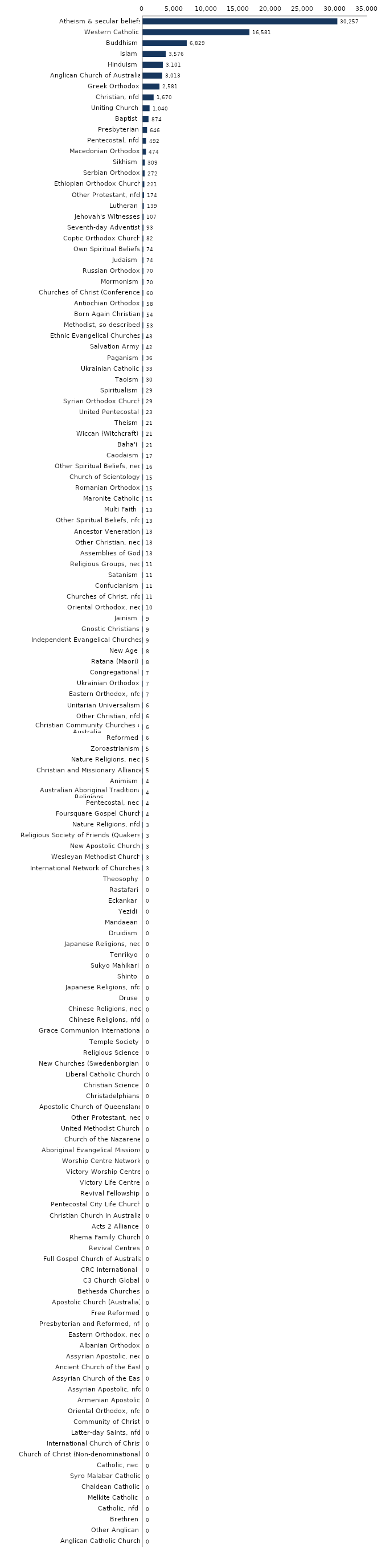
| Category | Series 0 |
|---|---|
| Atheism & secular beliefs | 30257 |
| Western Catholic | 16581 |
| Buddhism | 6829 |
| Islam | 3576 |
| Hinduism | 3101 |
| Anglican Church of Australia | 3013 |
| Greek Orthodox | 2581 |
| Christian, nfd | 1670 |
| Uniting Church | 1040 |
| Baptist | 874 |
| Presbyterian | 646 |
| Pentecostal, nfd | 492 |
| Macedonian Orthodox | 474 |
| Sikhism | 309 |
| Serbian Orthodox | 272 |
| Ethiopian Orthodox Church | 221 |
| Other Protestant, nfd | 174 |
| Lutheran | 139 |
| Jehovah's Witnesses | 107 |
| Seventh-day Adventist | 93 |
| Coptic Orthodox Church | 82 |
| Own Spiritual Beliefs | 74 |
| Judaism | 74 |
| Russian Orthodox | 70 |
| Mormonism | 70 |
| Churches of Christ (Conference) | 60 |
| Antiochian Orthodox | 58 |
| Born Again Christian | 54 |
| Methodist, so described | 53 |
| Ethnic Evangelical Churches | 43 |
| Salvation Army | 42 |
| Paganism | 36 |
| Ukrainian Catholic | 33 |
| Taoism | 30 |
| Spiritualism | 29 |
| Syrian Orthodox Church | 29 |
| United Pentecostal | 23 |
| Theism | 21 |
| Wiccan (Witchcraft) | 21 |
| Baha'i | 21 |
| Caodaism | 17 |
| Other Spiritual Beliefs, nec | 16 |
| Church of Scientology | 15 |
| Romanian Orthodox | 15 |
| Maronite Catholic | 15 |
| Multi Faith | 13 |
| Other Spiritual Beliefs, nfd | 13 |
| Ancestor Veneration | 13 |
| Other Christian, nec | 13 |
| Assemblies of God | 13 |
| Religious Groups, nec | 11 |
| Satanism | 11 |
| Confucianism | 11 |
| Churches of Christ, nfd | 11 |
| Oriental Orthodox, nec | 10 |
| Jainism | 9 |
| Gnostic Christians | 9 |
| Independent Evangelical Churches | 9 |
| New Age | 8 |
| Ratana (Maori) | 8 |
| Congregational | 7 |
| Ukrainian Orthodox | 7 |
| Eastern Orthodox, nfd | 7 |
| Unitarian Universalism | 6 |
| Other Christian, nfd | 6 |
| Christian Community Churches of Australia | 6 |
| Reformed | 6 |
| Zoroastrianism | 5 |
| Nature Religions, nec | 5 |
| Christian and Missionary Alliance | 5 |
| Animism | 4 |
| Australian Aboriginal Traditional Religions | 4 |
| Pentecostal, nec | 4 |
| Foursquare Gospel Church | 4 |
| Nature Religions, nfd | 3 |
| Religious Society of Friends (Quakers) | 3 |
| New Apostolic Church | 3 |
| Wesleyan Methodist Church | 3 |
| International Network of Churches  | 3 |
| Theosophy | 0 |
| Rastafari | 0 |
| Eckankar | 0 |
| Yezidi | 0 |
| Mandaean | 0 |
| Druidism | 0 |
| Japanese Religions, nec | 0 |
| Tenrikyo | 0 |
| Sukyo Mahikari | 0 |
| Shinto | 0 |
| Japanese Religions, nfd | 0 |
| Druse | 0 |
| Chinese Religions, nec | 0 |
| Chinese Religions, nfd | 0 |
| Grace Communion International | 0 |
| Temple Society | 0 |
| Religious Science | 0 |
| New Churches (Swedenborgian) | 0 |
| Liberal Catholic Church | 0 |
| Christian Science | 0 |
| Christadelphians | 0 |
| Apostolic Church of Queensland | 0 |
| Other Protestant, nec | 0 |
| United Methodist Church | 0 |
| Church of the Nazarene | 0 |
| Aboriginal Evangelical Missions | 0 |
| Worship Centre Network | 0 |
| Victory Worship Centre | 0 |
| Victory Life Centre | 0 |
| Revival Fellowship | 0 |
| Pentecostal City Life Church | 0 |
| Christian Church in Australia | 0 |
| Acts 2 Alliance | 0 |
| Rhema Family Church | 0 |
| Revival Centres | 0 |
| Full Gospel Church of Australia | 0 |
| CRC International  | 0 |
| C3 Church Global | 0 |
| Bethesda Churches | 0 |
| Apostolic Church (Australia) | 0 |
| Free Reformed | 0 |
| Presbyterian and Reformed, nfd | 0 |
| Eastern Orthodox, nec | 0 |
| Albanian Orthodox | 0 |
| Assyrian Apostolic, nec | 0 |
| Ancient Church of the East | 0 |
| Assyrian Church of the East | 0 |
| Assyrian Apostolic, nfd | 0 |
| Armenian Apostolic | 0 |
| Oriental Orthodox, nfd | 0 |
| Community of Christ | 0 |
| Latter-day Saints, nfd | 0 |
| International Church of Christ | 0 |
| Church of Christ (Non-denominational) | 0 |
| Catholic, nec | 0 |
| Syro Malabar Catholic | 0 |
| Chaldean Catholic | 0 |
| Melkite Catholic | 0 |
| Catholic, nfd | 0 |
| Brethren | 0 |
| Other Anglican | 0 |
| Anglican Catholic Church | 0 |